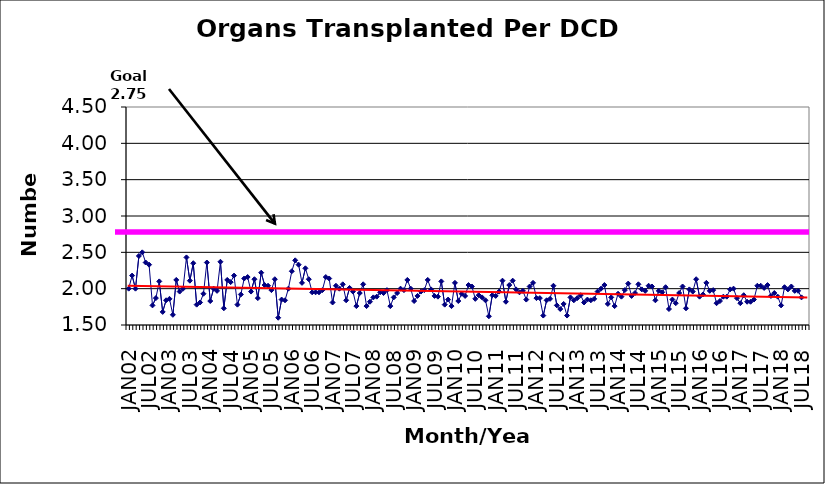
| Category | Series 0 |
|---|---|
| JAN02 | 2 |
| FEB02 | 2.18 |
| MAR02 | 2 |
| APR02 | 2.45 |
| MAY02 | 2.5 |
| JUN02 | 2.36 |
| JUL02 | 2.33 |
| AUG02 | 1.77 |
| SEP02 | 1.87 |
| OCT02 | 2.1 |
| NOV02 | 1.68 |
| DEC02 | 1.84 |
| JAN03 | 1.86 |
| FEB03 | 1.64 |
| MAR03 | 2.12 |
| APR03 | 1.96 |
| MAY03 | 2 |
| JUN03 | 2.43 |
| JUL03 | 2.11 |
| AUG03 | 2.35 |
| SEP03 | 1.78 |
| OCT03 | 1.81 |
| NOV03 | 1.93 |
| DEC03 | 2.36 |
| JAN04 | 1.83 |
| FEB04 | 2 |
| MAR04 | 1.97 |
| APR04 | 2.37 |
| MAY04 | 1.73 |
| JUN04 | 2.12 |
| JUL04 | 2.09 |
| AUG04 | 2.18 |
| SEP04 | 1.78 |
| OCT04 | 1.92 |
| NOV04 | 2.14 |
| DEC04 | 2.16 |
| JAN05 | 1.96 |
| FEB05 | 2.13 |
| MAR05 | 1.87 |
| APR05 | 2.22 |
| MAY05 | 2.05 |
| JUN05 | 2.04 |
| JUL05 | 1.98 |
| AUG05 | 2.13 |
| SEP05 | 1.6 |
| OCT05 | 1.85 |
| NOV05 | 1.84 |
| DEC05 | 2 |
| JAN06 | 2.24 |
| FEB06 | 2.39 |
| MAR06 | 2.33 |
| APR06 | 2.08 |
| MAY06 | 2.28 |
| JUN06 | 2.13 |
| JUL06 | 1.95 |
| AUG06 | 1.95 |
| SEP06 | 1.95 |
| OCT06 | 1.98 |
| NOV06 | 2.16 |
| DEC06 | 2.14 |
| JAN07 | 1.81 |
| FEB07 | 2.04 |
| MAR07 | 2 |
| APR07 | 2.06 |
| MAY07 | 1.84 |
| JUN07 | 2.01 |
| JUL07 | 1.96 |
| AUG07 | 1.76 |
| SEP07 | 1.94 |
| OCT07 | 2.06 |
| NOV07 | 1.76 |
| DEC07 | 1.82 |
| JAN08 | 1.88 |
| FEB08 | 1.89 |
| MAR08 | 1.95 |
| APR08 | 1.94 |
| MAY08 | 1.98 |
| JUN08 | 1.76 |
| JUL08 | 1.88 |
| AUG08 | 1.94 |
| SEP08 | 2 |
| OCT08 | 1.98 |
| NOV08 | 2.12 |
| DEC08 | 2 |
| JAN09 | 1.83 |
| FEB09 | 1.9 |
| MAR09 | 1.96 |
| APR09 | 1.98 |
| MAY09 | 2.12 |
| JUN09 | 1.99 |
| JUL09 | 1.9 |
| AUG09 | 1.89 |
| SEP09 | 2.1 |
| OCT09 | 1.78 |
| NOV09 | 1.85 |
| DEC09 | 1.76 |
| JAN10 | 2.08 |
| FEB10 | 1.83 |
| MAR10 | 1.93 |
| APR10 | 1.9 |
| MAY10 | 2.05 |
| JUN10 | 2.03 |
| JUL10 | 1.86 |
| AUG10 | 1.91 |
| SEP10 | 1.88 |
| OCT10 | 1.84 |
| NOV10 | 1.62 |
| DEC10 | 1.91 |
| JAN11 | 1.9 |
| FEB11 | 1.96 |
| MAR11 | 2.11 |
| APR11 | 1.82 |
| MAY11 | 2.05 |
| JUN11 | 2.11 |
| JUL11 | 1.99 |
| AUG11 | 1.95 |
| SEP11 | 1.97 |
| OCT11 | 1.85 |
| NOV11 | 2.03 |
| DEC11 | 2.08 |
| JAN12 | 1.87 |
| FEB12 | 1.87 |
| MAR12 | 1.63 |
| APR12 | 1.84 |
| MAY12 | 1.86 |
| JUN12 | 2.04 |
| JUL12 | 1.77 |
| AUG12 | 1.72 |
| SEP12 | 1.79 |
| OCT12 | 1.63 |
| NOV12 | 1.88 |
| DEC12 | 1.84 |
| JAN13 | 1.87 |
| FEB13 | 1.91 |
| MAR13 | 1.81 |
| APR13 | 1.85 |
| MAY13 | 1.84 |
| JUN13 | 1.86 |
| JUL13 | 1.96 |
| AUG13 | 2 |
| SEP13 | 2.05 |
| OCT13 | 1.79 |
| NOV13 | 1.88 |
| DEC13 | 1.76 |
| JAN14 | 1.93 |
| FEB14 | 1.89 |
| MAR14 | 1.98 |
| APR14 | 2.07 |
| MAY14 | 1.9 |
| JUN14 | 1.94 |
| JUL14 | 2.06 |
| AUG14 | 1.99 |
| SEP14 | 1.97 |
| OCT14 | 2.04 |
| NOV14 | 2.03 |
| DEC14 | 1.84 |
| JAN15 | 1.97 |
| FEB15 | 1.95 |
| MAR15 | 2.02 |
| APR15 | 1.72 |
| MAY15 | 1.85 |
| JUN15 | 1.8 |
| JUL15 | 1.94 |
| AUG15 | 2.03 |
| SEP15 | 1.73 |
| OCT15 | 1.99 |
| NOV15 | 1.96 |
| DEC15 | 2.13 |
| JAN16 | 1.89 |
| FEB16 | 1.92 |
| MAR16 | 2.08 |
| APR16 | 1.97 |
| MAY16 | 1.98 |
| JUN16 | 1.8 |
| JUL16 | 1.83 |
| AUG16 | 1.89 |
| SEP16 | 1.89 |
| OCT16 | 1.99 |
| NOV16 | 2 |
| DEC16 | 1.87 |
| JAN17 | 1.8 |
| FEB17 | 1.91 |
| MAR17 | 1.82 |
| APR17 | 1.82 |
| MAY17 | 1.85 |
| JUN17 | 2.04 |
| JUL17 | 2.04 |
| AUG17 | 2.01 |
| SEP17 | 2.05 |
| OCT17 | 1.9 |
| NOV17 | 1.94 |
| DEC17 | 1.89 |
| JAN18 | 1.77 |
| FEB18 | 2.02 |
| MAR18 | 1.99 |
| APR18 | 2.03 |
| MAY18 | 1.97 |
| JUN18 | 1.97 |
| JUL18 | 1.88 |